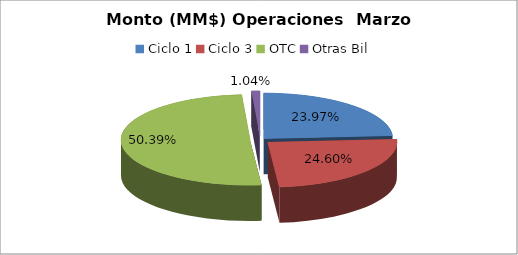
| Category | Series 0 |
|---|---|
| Ciclo 1 | 17760484.117 |
| Ciclo 3 | 18231676.991 |
| OTC | 37344676.439 |
| Otras Bil | 768460.999 |